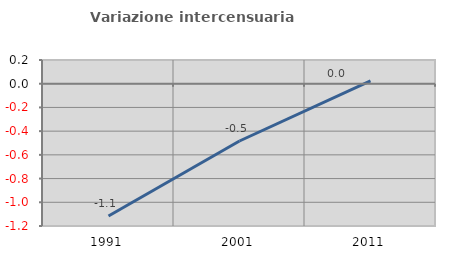
| Category | Variazione intercensuaria annua |
|---|---|
| 1991.0 | -1.116 |
| 2001.0 | -0.483 |
| 2011.0 | 0.024 |